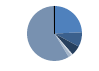
| Category | Series 0 |
|---|---|
| ARRASTRE | 336 |
| CERCO | 118 |
| PALANGRE | 80 |
| REDES DE ENMALLE | 12 |
| ARTES FIJAS | 25 |
| ARTES MENORES | 810 |
| SIN TIPO ASIGNADO | 1 |